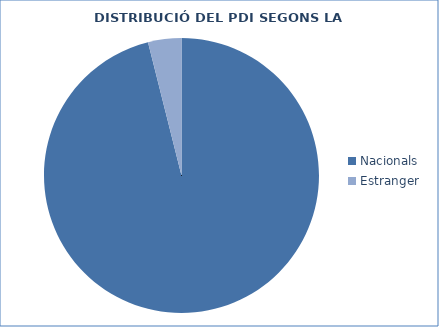
| Category | Series 0 |
|---|---|
| Nacionals | 2552 |
| Estranger | 104 |